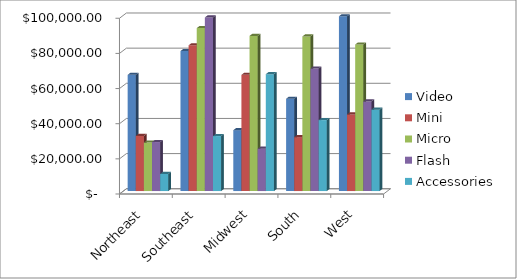
| Category | Video | Mini | Micro | Flash | Accessories  |
|---|---|---|---|---|---|
| Northeast | 66145.15 | 31375.24 | 27596.37 | 27885.59 | 9715.12 |
| Southeast | 79677.1 | 82937.72 | 92716.32 | 98800.57 | 31284.2 |
| Midwest | 34657.66 | 66137.5 | 88294.78 | 24111.33 | 66527.37 |
| South | 52517.2 | 30681.82 | 87984.79 | 69737.51 | 40374.83 |
| West | 99455.49 | 43595.24 | 83380.72 | 51003.09 | 46321.88 |